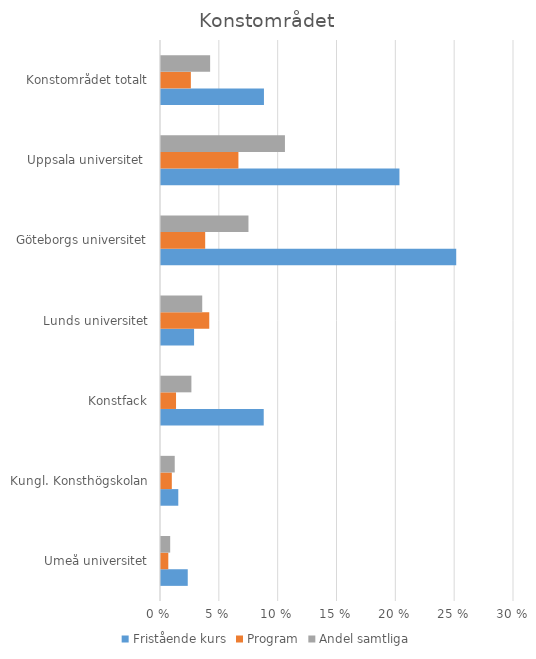
| Category | Fristående kurs | Program | Andel samtliga |
|---|---|---|---|
| Umeå universitet | 0.023 | 0.006 | 0.008 |
| Kungl. Konsthögskolan | 0.015 | 0.009 | 0.012 |
| Konstfack | 0.087 | 0.013 | 0.026 |
| Lunds universitet | 0.028 | 0.041 | 0.035 |
| Göteborgs universitet | 0.251 | 0.038 | 0.074 |
| Uppsala universitet  | 0.203 | 0.066 | 0.105 |
| Konstområdet totalt | 0.087 | 0.025 | 0.042 |